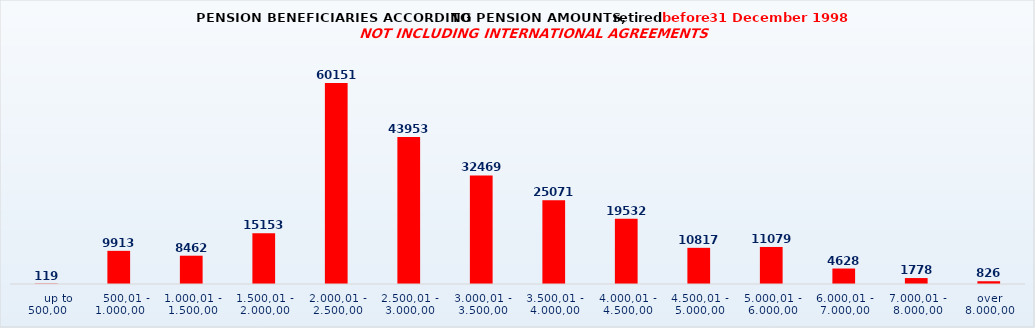
| Category | Series 0 |
|---|---|
|      up to 500,00 | 119 |
|    500,01 - 1.000,00 | 9913 |
| 1.000,01 - 1.500,00 | 8462 |
| 1.500,01 - 2.000,00 | 15153 |
| 2.000,01 - 2.500,00 | 60151 |
| 2.500,01 - 3.000,00 | 43953 |
| 3.000,01 - 3.500,00 | 32469 |
| 3.500,01 - 4.000,00 | 25071 |
| 4.000,01 - 4.500,00 | 19532 |
| 4.500,01 - 5.000,00 | 10817 |
| 5.000,01 - 6.000,00 | 11079 |
| 6.000,01 - 7.000,00 | 4628 |
| 7.000,01 - 8.000,00 | 1778 |
| over 8.000,00 | 826 |